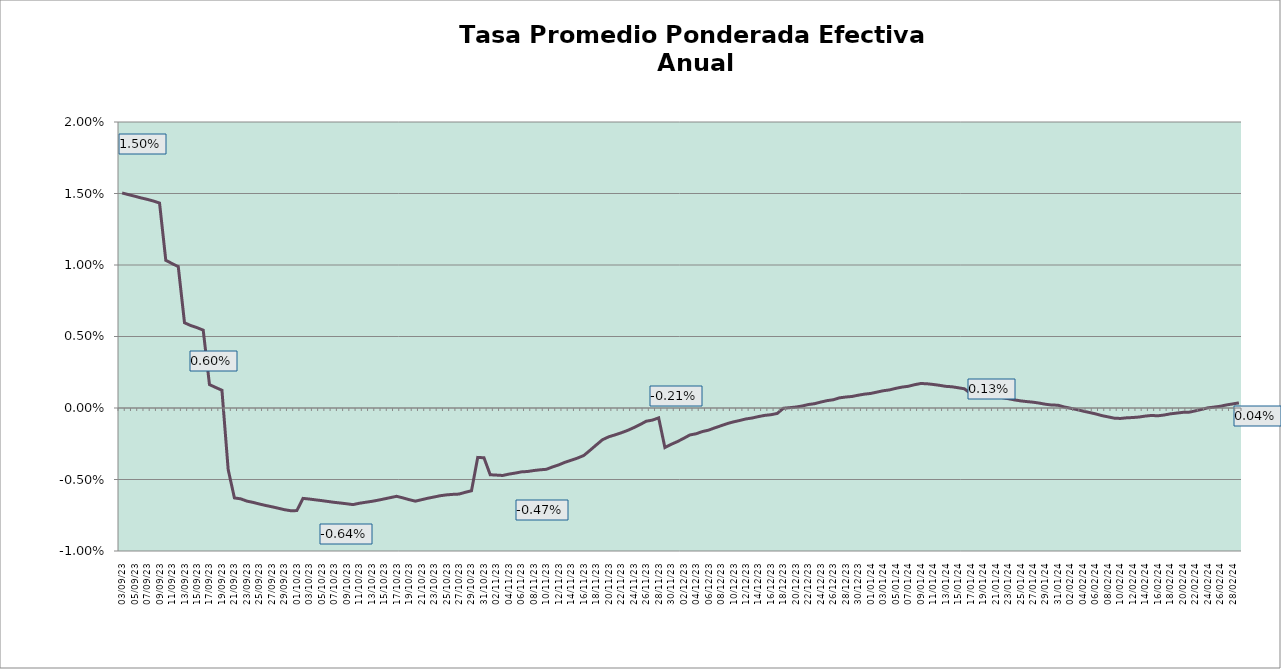
| Category | TEA |
|---|---|
| 2023-09-03 | 0.015 |
| 2023-09-04 | 0.015 |
| 2023-09-05 | 0.015 |
| 2023-09-06 | 0.015 |
| 2023-09-07 | 0.015 |
| 2023-09-08 | 0.014 |
| 2023-09-09 | 0.014 |
| 2023-09-10 | 0.01 |
| 2023-09-11 | 0.01 |
| 2023-09-12 | 0.01 |
| 2023-09-13 | 0.006 |
| 2023-09-14 | 0.006 |
| 2023-09-15 | 0.006 |
| 2023-09-16 | 0.005 |
| 2023-09-17 | 0.002 |
| 2023-09-18 | 0.001 |
| 2023-09-19 | 0.001 |
| 2023-09-20 | -0.004 |
| 2023-09-21 | -0.006 |
| 2023-09-22 | -0.006 |
| 2023-09-23 | -0.007 |
| 2023-09-24 | -0.007 |
| 2023-09-25 | -0.007 |
| 2023-09-26 | -0.007 |
| 2023-09-27 | -0.007 |
| 2023-09-28 | -0.007 |
| 2023-09-29 | -0.007 |
| 2023-09-30 | -0.007 |
| 2023-10-01 | -0.007 |
| 2023-10-02 | -0.006 |
| 2023-10-03 | -0.006 |
| 2023-10-04 | -0.006 |
| 2023-10-05 | -0.006 |
| 2023-10-06 | -0.007 |
| 2023-10-07 | -0.007 |
| 2023-10-08 | -0.007 |
| 2023-10-09 | -0.007 |
| 2023-10-10 | -0.007 |
| 2023-10-11 | -0.007 |
| 2023-10-12 | -0.007 |
| 2023-10-13 | -0.007 |
| 2023-10-14 | -0.006 |
| 2023-10-15 | -0.006 |
| 2023-10-16 | -0.006 |
| 2023-10-17 | -0.006 |
| 2023-10-18 | -0.006 |
| 2023-10-19 | -0.006 |
| 2023-10-20 | -0.007 |
| 2023-10-21 | -0.006 |
| 2023-10-22 | -0.006 |
| 2023-10-23 | -0.006 |
| 2023-10-24 | -0.006 |
| 2023-10-25 | -0.006 |
| 2023-10-26 | -0.006 |
| 2023-10-27 | -0.006 |
| 2023-10-28 | -0.006 |
| 2023-10-29 | -0.006 |
| 2023-10-30 | -0.003 |
| 2023-10-31 | -0.003 |
| 2023-11-01 | -0.005 |
| 2023-11-02 | -0.005 |
| 2023-11-03 | -0.005 |
| 2023-11-04 | -0.005 |
| 2023-11-05 | -0.005 |
| 2023-11-06 | -0.004 |
| 2023-11-07 | -0.004 |
| 2023-11-08 | -0.004 |
| 2023-11-09 | -0.004 |
| 2023-11-10 | -0.004 |
| 2023-11-11 | -0.004 |
| 2023-11-12 | -0.004 |
| 2023-11-13 | -0.004 |
| 2023-11-14 | -0.004 |
| 2023-11-15 | -0.004 |
| 2023-11-16 | -0.003 |
| 2023-11-17 | -0.003 |
| 2023-11-18 | -0.003 |
| 2023-11-19 | -0.002 |
| 2023-11-20 | -0.002 |
| 2023-11-21 | -0.002 |
| 2023-11-22 | -0.002 |
| 2023-11-23 | -0.002 |
| 2023-11-24 | -0.001 |
| 2023-11-25 | -0.001 |
| 2023-11-26 | -0.001 |
| 2023-11-27 | -0.001 |
| 2023-11-28 | -0.001 |
| 2023-11-29 | -0.003 |
| 2023-11-30 | -0.003 |
| 2023-12-01 | -0.002 |
| 2023-12-02 | -0.002 |
| 2023-12-03 | -0.002 |
| 2023-12-04 | -0.002 |
| 2023-12-05 | -0.002 |
| 2023-12-06 | -0.002 |
| 2023-12-07 | -0.001 |
| 2023-12-08 | -0.001 |
| 2023-12-09 | -0.001 |
| 2023-12-10 | -0.001 |
| 2023-12-11 | -0.001 |
| 2023-12-12 | -0.001 |
| 2023-12-13 | -0.001 |
| 2023-12-14 | -0.001 |
| 2023-12-15 | -0.001 |
| 2023-12-16 | 0 |
| 2023-12-17 | 0 |
| 2023-12-18 | 0 |
| 2023-12-19 | 0 |
| 2023-12-20 | 0 |
| 2023-12-21 | 0 |
| 2023-12-22 | 0 |
| 2023-12-23 | 0 |
| 2023-12-24 | 0 |
| 2023-12-25 | 0.001 |
| 2023-12-26 | 0.001 |
| 2023-12-27 | 0.001 |
| 2023-12-28 | 0.001 |
| 2023-12-29 | 0.001 |
| 2023-12-30 | 0.001 |
| 2023-12-31 | 0.001 |
| 2024-01-01 | 0.001 |
| 2024-01-02 | 0.001 |
| 2024-01-03 | 0.001 |
| 2024-01-04 | 0.001 |
| 2024-01-05 | 0.001 |
| 2024-01-06 | 0.001 |
| 2024-01-07 | 0.002 |
| 2024-01-08 | 0.002 |
| 2024-01-09 | 0.002 |
| 2024-01-10 | 0.002 |
| 2024-01-11 | 0.002 |
| 2024-01-12 | 0.002 |
| 2024-01-13 | 0.002 |
| 2024-01-14 | 0.001 |
| 2024-01-15 | 0.001 |
| 2024-01-16 | 0.001 |
| 2024-01-17 | 0.001 |
| 2024-01-18 | 0.001 |
| 2024-01-19 | 0.001 |
| 2024-01-20 | 0.001 |
| 2024-01-21 | 0.001 |
| 2024-01-22 | 0.001 |
| 2024-01-23 | 0.001 |
| 2024-01-24 | 0.001 |
| 2024-01-25 | 0 |
| 2024-01-26 | 0 |
| 2024-01-27 | 0 |
| 2024-01-28 | 0 |
| 2024-01-29 | 0 |
| 2024-01-30 | 0 |
| 2024-01-31 | 0 |
| 2024-02-01 | 0 |
| 2024-02-02 | 0 |
| 2024-02-03 | 0 |
| 2024-02-04 | 0 |
| 2024-02-05 | 0 |
| 2024-02-06 | 0 |
| 2024-02-07 | -0.001 |
| 2024-02-08 | -0.001 |
| 2024-02-09 | -0.001 |
| 2024-02-10 | -0.001 |
| 2024-02-11 | -0.001 |
| 2024-02-12 | -0.001 |
| 2024-02-13 | -0.001 |
| 2024-02-14 | -0.001 |
| 2024-02-15 | -0.001 |
| 2024-02-16 | -0.001 |
| 2024-02-17 | 0 |
| 2024-02-18 | 0 |
| 2024-02-19 | 0 |
| 2024-02-20 | 0 |
| 2024-02-21 | 0 |
| 2024-02-22 | 0 |
| 2024-02-23 | 0 |
| 2024-02-24 | 0 |
| 2024-02-25 | 0 |
| 2024-02-26 | 0 |
| 2024-02-27 | 0 |
| 2024-02-28 | 0 |
| 2024-02-29 | 0 |